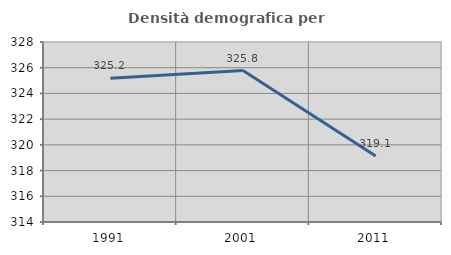
| Category | Densità demografica |
|---|---|
| 1991.0 | 325.189 |
| 2001.0 | 325.776 |
| 2011.0 | 319.127 |